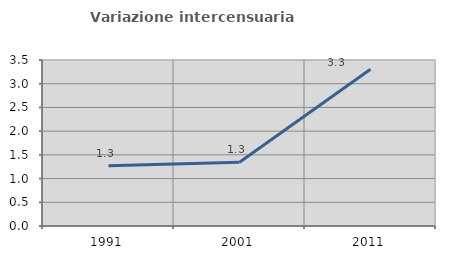
| Category | Variazione intercensuaria annua |
|---|---|
| 1991.0 | 1.273 |
| 2001.0 | 1.343 |
| 2011.0 | 3.306 |